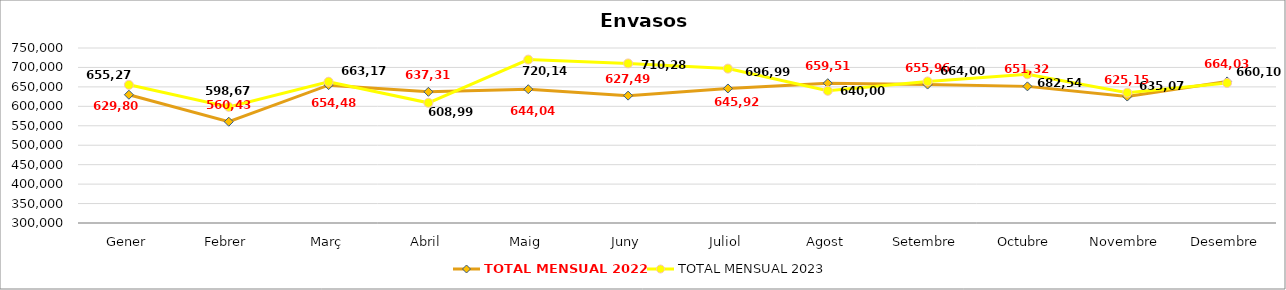
| Category | TOTAL MENSUAL 2022 | TOTAL MENSUAL 2023 |
|---|---|---|
| Gener | 629807 | 655274.203 |
| Febrer | 560436 | 598675.055 |
| Març | 654482 | 663175.204 |
| Abril | 637313.087 | 608995.533 |
| Maig | 644043.932 | 720140.572 |
| Juny | 627490.833 | 710283.124 |
| Juliol | 645919.959 | 696998.272 |
| Agost | 659514.581 | 640008.424 |
| Setembre | 655967.485 | 664004.967 |
| Octubre | 651322.899 | 682548.397 |
| Novembre | 625152.633 | 635076.13 |
| Desembre | 664031.826 | 660102.19 |